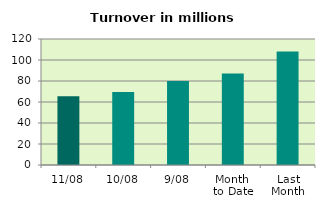
| Category | Series 0 |
|---|---|
| 11/08 | 65.421 |
| 10/08 | 69.439 |
| 9/08 | 79.914 |
| Month 
to Date | 87.246 |
| Last
Month | 108.022 |